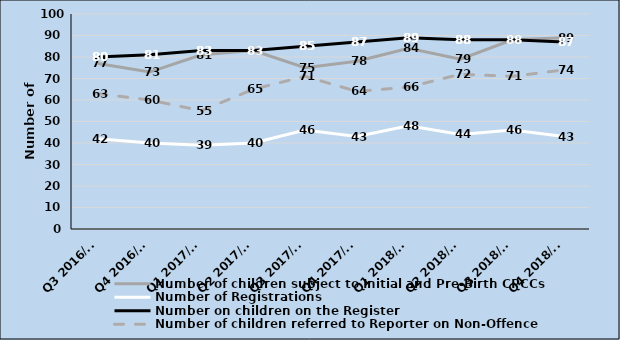
| Category | Number of children subject to Initial and Pre-Birth CPCCs | Number of Registrations | Number on children on the Register | Number of children referred to Reporter on Non-Offence Grounds |
|---|---|---|---|---|
| Q3 2016/17 | 77 | 42 | 80 | 63 |
| Q4 2016/17 | 73 | 40 | 81 | 60 |
| Q1 2017/18 | 81 | 39 | 83 | 55 |
| Q2 2017/18 | 83 | 40 | 83 | 65 |
| Q3 2017/18 | 75 | 46 | 85 | 71 |
| Q4 2017/18 | 78 | 43 | 87 | 64 |
| Q1 2018/19 | 84 | 48 | 89 | 66 |
| Q2 2018/19 | 79 | 44 | 88 | 72 |
| Q3 2018/19 | 88 | 46 | 88 | 71 |
| Q4 2018/19 | 89 | 43 | 87 | 74 |